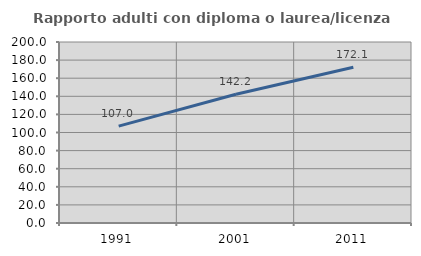
| Category | Rapporto adulti con diploma o laurea/licenza media  |
|---|---|
| 1991.0 | 107.018 |
| 2001.0 | 142.207 |
| 2011.0 | 172.059 |